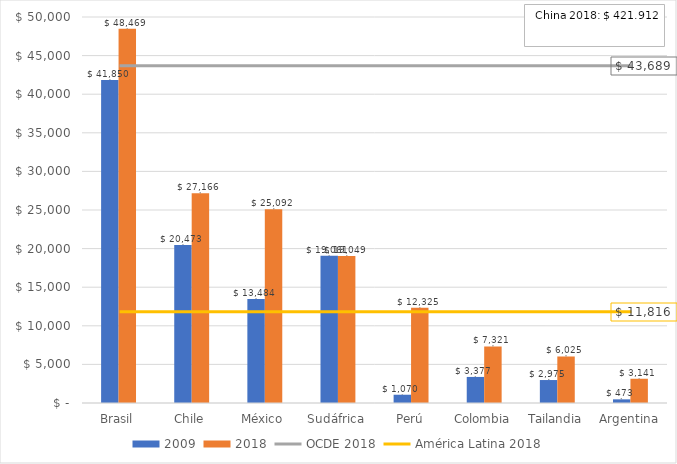
| Category | 2009 | 2018 |
|---|---|---|
| Brasil | 41849.513 | 48468.789 |
| Chile | 20472.94 | 27165.731 |
| México | 13483.902 | 25091.909 |
| Sudáfrica | 19061.013 | 19048.815 |
| Perú | 1070.241 | 12325.041 |
| Colombia | 3377.329 | 7321.421 |
| Tailandia | 2974.93 | 6024.641 |
| Argentina | 472.996 | 3140.974 |